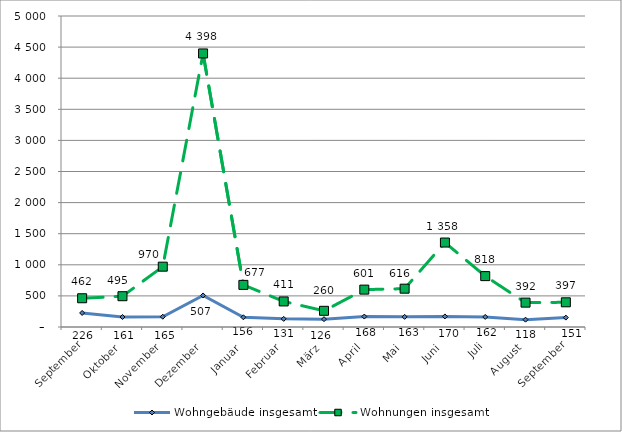
| Category | Wohngebäude insgesamt | Wohnungen insgesamt |
|---|---|---|
| September | 226 | 462 |
| Oktober | 161 | 495 |
| November | 165 | 970 |
| Dezember | 507 | 4398 |
| Januar | 156 | 677 |
| Februar | 131 | 411 |
| März | 126 | 260 |
| April | 168 | 601 |
| Mai | 163 | 616 |
| Juni | 170 | 1358 |
| Juli | 162 | 818 |
| August | 118 | 392 |
| September | 151 | 397 |